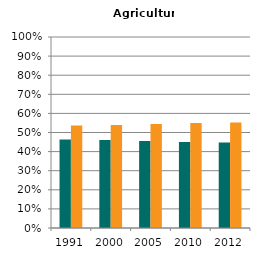
| Category | Male | Female |
|---|---|---|
| 1991.0 | 0.463 | 0.537 |
| 2000.0 | 0.461 | 0.539 |
| 2005.0 | 0.456 | 0.544 |
| 2010.0 | 0.45 | 0.55 |
| 2012.0 | 0.448 | 0.552 |